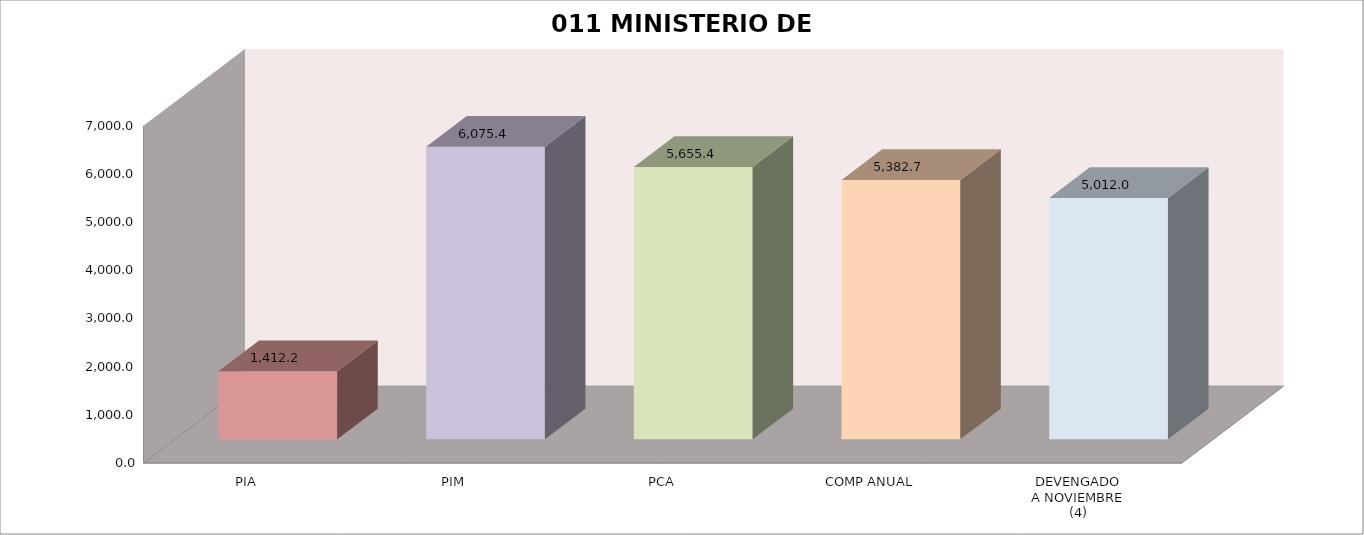
| Category | 011 MINISTERIO DE SALUD |
|---|---|
| PIA | 1412.218 |
| PIM | 6075.402 |
| PCA | 5655.373 |
| COMP ANUAL | 5382.721 |
| DEVENGADO
A NOVIEMBRE
(4) | 5012.018 |